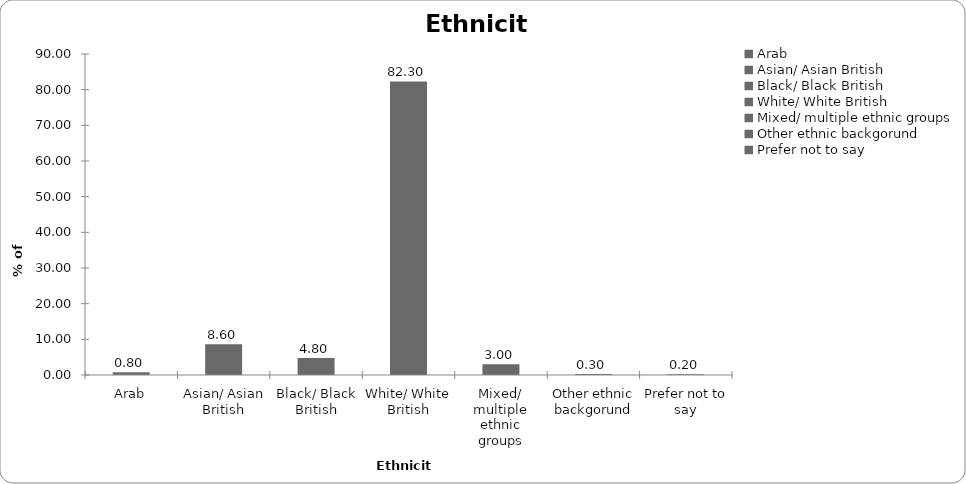
| Category | Ethnicity |
|---|---|
| Arab | 0.8 |
| Asian/ Asian British | 8.6 |
| Black/ Black British | 4.8 |
| White/ White British | 82.3 |
| Mixed/ multiple ethnic groups | 3 |
| Other ethnic backgorund | 0.3 |
| Prefer not to say | 0.2 |